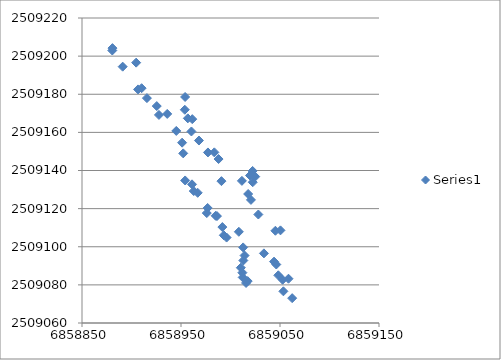
| Category | Series 0 |
|---|---|
| 6858966.878 | 2509128.294 |
| 6858962.887 | 2509129.227 |
| 6858961.136 | 2509132.74 |
| 6858954.213 | 2509134.776 |
| 6858952.229 | 2509148.987 |
| 6858951.107 | 2509154.598 |
| 6858945.245 | 2509160.751 |
| 6858936.083 | 2509169.68 |
| 6858927.708 | 2509169.15 |
| 6858925.513 | 2509173.802 |
| 6858915.556 | 2509177.971 |
| 6858910.227 | 2509183.175 |
| 6858906.614 | 2509182.535 |
| 6858904.707 | 2509196.576 |
| 6858891.089 | 2509194.464 |
| 6858880.578 | 2509202.948 |
| 6858880.774 | 2509204.202 |
| 6858976.895 | 2509120.351 |
| 6858976.053 | 2509117.667 |
| 6858984.999 | 2509116.238 |
| 6858986.324 | 2509116.085 |
| 6858991.78 | 2509110.326 |
| 6858993.225 | 2509106.016 |
| 6858996.05 | 2509104.825 |
| 6859008.422 | 2509107.847 |
| 6859012.772 | 2509099.654 |
| 6859014.211 | 2509095.39 |
| 6859012.971 | 2509092.79 |
| 6859010.402 | 2509089.003 |
| 6859012.016 | 2509086.409 |
| 6859012.318 | 2509083.926 |
| 6859015.695 | 2509080.999 |
| 6859017.354 | 2509081.976 |
| 6859033.751 | 2509096.532 |
| 6859043.989 | 2509092.193 |
| 6859046.241 | 2509090.685 |
| 6859048.289 | 2509085.022 |
| 6859052.627 | 2509082.689 |
| 6859053.439 | 2509076.622 |
| 6859062.28 | 2509073.032 |
| 6859058.58 | 2509083.222 |
| 6859050.46 | 2509108.592 |
| 6859045.371 | 2509108.392 |
| 6859028.132 | 2509116.911 |
| 6859020.644 | 2509124.574 |
| 6859017.837 | 2509127.679 |
| 6859022.469 | 2509133.849 |
| 6859024.958 | 2509136.782 |
| 6859022.335 | 2509139.767 |
| 6859019.709 | 2509137.389 |
| 6859011.502 | 2509134.558 |
| 6858990.856 | 2509134.417 |
| 6858987.954 | 2509146.01 |
| 6858983.679 | 2509149.519 |
| 6858977.231 | 2509149.469 |
| 6858968.135 | 2509155.724 |
| 6858960.542 | 2509160.469 |
| 6858961.376 | 2509166.942 |
| 6858956.911 | 2509167.359 |
| 6858953.831 | 2509171.865 |
| 6858954.138 | 2509178.571 |